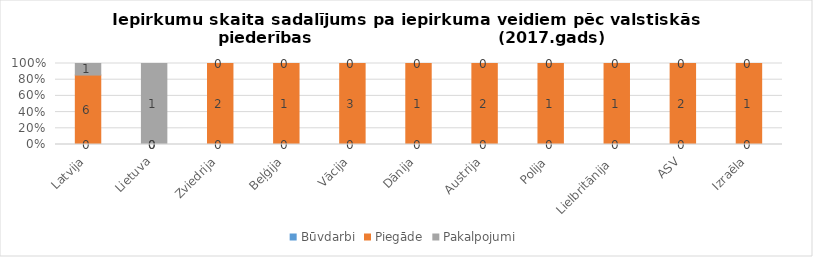
| Category | Būvdarbi | Piegāde | Pakalpojumi |
|---|---|---|---|
| Latvija | 0 | 6 | 1 |
| Lietuva | 0 | 0 | 1 |
| Zviedrija | 0 | 2 | 0 |
| Beļģija | 0 | 1 | 0 |
| Vācija | 0 | 3 | 0 |
| Dānija | 0 | 1 | 0 |
| Austrija | 0 | 2 | 0 |
| Polija | 0 | 1 | 0 |
| Lielbritānija  | 0 | 1 | 0 |
| ASV | 0 | 2 | 0 |
| Izraēla | 0 | 1 | 0 |